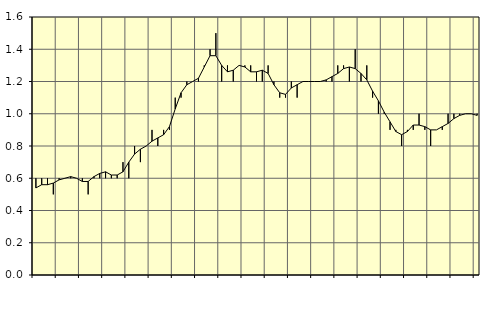
| Category | Piggar | Fast anställda utomlands |
|---|---|---|
| nan | 0.6 | 0.54 |
| 1.0 | 0.6 | 0.56 |
| 1.0 | 0.6 | 0.56 |
| 1.0 | 0.5 | 0.57 |
| nan | 0.6 | 0.59 |
| 2.0 | 0.6 | 0.6 |
| 2.0 | 0.6 | 0.61 |
| 2.0 | 0.6 | 0.6 |
| nan | 0.6 | 0.58 |
| 3.0 | 0.5 | 0.58 |
| 3.0 | 0.6 | 0.61 |
| 3.0 | 0.6 | 0.63 |
| nan | 0.6 | 0.64 |
| 4.0 | 0.6 | 0.62 |
| 4.0 | 0.6 | 0.62 |
| 4.0 | 0.7 | 0.64 |
| nan | 0.6 | 0.7 |
| 5.0 | 0.8 | 0.75 |
| 5.0 | 0.7 | 0.78 |
| 5.0 | 0.8 | 0.8 |
| nan | 0.9 | 0.83 |
| 6.0 | 0.8 | 0.85 |
| 6.0 | 0.9 | 0.87 |
| 6.0 | 0.9 | 0.92 |
| nan | 1.1 | 1.03 |
| 7.0 | 1.1 | 1.13 |
| 7.0 | 1.2 | 1.18 |
| 7.0 | 1.2 | 1.2 |
| nan | 1.2 | 1.22 |
| 8.0 | 1.3 | 1.29 |
| 8.0 | 1.4 | 1.36 |
| 8.0 | 1.5 | 1.36 |
| nan | 1.2 | 1.3 |
| 9.0 | 1.3 | 1.26 |
| 9.0 | 1.2 | 1.27 |
| 9.0 | 1.3 | 1.3 |
| nan | 1.3 | 1.29 |
| 10.0 | 1.3 | 1.26 |
| 10.0 | 1.2 | 1.26 |
| 10.0 | 1.2 | 1.27 |
| nan | 1.3 | 1.25 |
| 11.0 | 1.2 | 1.18 |
| 11.0 | 1.1 | 1.13 |
| 11.0 | 1.1 | 1.12 |
| nan | 1.2 | 1.16 |
| 12.0 | 1.1 | 1.18 |
| 12.0 | 1.2 | 1.2 |
| 12.0 | 1.2 | 1.2 |
| nan | 1.2 | 1.2 |
| 13.0 | 1.2 | 1.2 |
| 13.0 | 1.2 | 1.21 |
| 13.0 | 1.2 | 1.23 |
| nan | 1.3 | 1.25 |
| 14.0 | 1.3 | 1.28 |
| 14.0 | 1.2 | 1.29 |
| 14.0 | 1.4 | 1.28 |
| nan | 1.2 | 1.25 |
| 15.0 | 1.3 | 1.21 |
| 15.0 | 1.1 | 1.14 |
| 15.0 | 1 | 1.08 |
| nan | 1 | 1.01 |
| 16.0 | 0.9 | 0.95 |
| 16.0 | 0.9 | 0.89 |
| 16.0 | 0.8 | 0.87 |
| nan | 0.9 | 0.89 |
| 17.0 | 0.9 | 0.93 |
| 17.0 | 1 | 0.93 |
| 17.0 | 0.9 | 0.92 |
| nan | 0.8 | 0.9 |
| 18.0 | 0.9 | 0.9 |
| 18.0 | 0.9 | 0.92 |
| 18.0 | 1 | 0.94 |
| nan | 1 | 0.97 |
| 19.0 | 1 | 0.99 |
| 19.0 | 1 | 1 |
| 19.0 | 1 | 1 |
| nan | 1 | 0.99 |